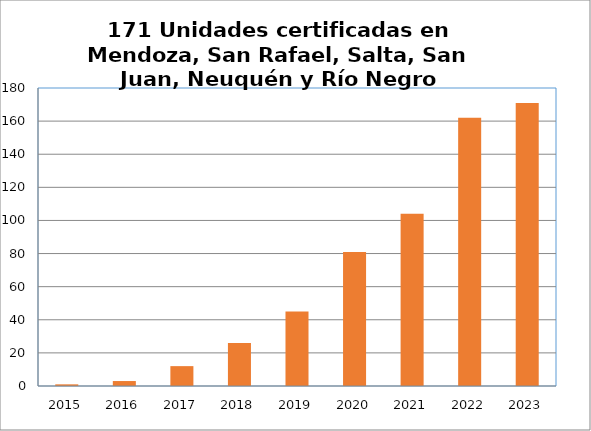
| Category | Series 1 |
|---|---|
| 2015.0 | 1 |
| 2016.0 | 3 |
| 2017.0 | 12 |
| 2018.0 | 26 |
| 2019.0 | 45 |
| 2020.0 | 81 |
| 2021.0 | 104 |
| 2022.0 | 162 |
| 2023.0 | 171 |